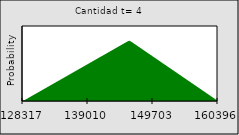
| Category | Series 0 |
|---|---|
| 128316.95757065 | 0 |
| nan | 0 |
| nan | 0.001 |
| nan | 0.001 |
| nan | 0.001 |
| nan | 0.002 |
| nan | 0.002 |
| nan | 0.003 |
| nan | 0.003 |
| nan | 0.003 |
| nan | 0.004 |
| nan | 0.004 |
| nan | 0.004 |
| nan | 0.005 |
| nan | 0.005 |
| nan | 0.006 |
| nan | 0.006 |
| nan | 0.006 |
| nan | 0.007 |
| nan | 0.007 |
| nan | 0.007 |
| nan | 0.008 |
| nan | 0.008 |
| nan | 0.009 |
| nan | 0.009 |
| nan | 0.009 |
| nan | 0.01 |
| nan | 0.01 |
| nan | 0.01 |
| nan | 0.011 |
| nan | 0.011 |
| nan | 0.012 |
| nan | 0.012 |
| 139010.03753870502 | 0.012 |
| nan | 0.013 |
| nan | 0.013 |
| nan | 0.013 |
| nan | 0.014 |
| nan | 0.014 |
| nan | 0.015 |
| nan | 0.015 |
| nan | 0.015 |
| nan | 0.016 |
| nan | 0.016 |
| nan | 0.016 |
| nan | 0.017 |
| nan | 0.017 |
| nan | 0.018 |
| nan | 0.018 |
| nan | 0.018 |
| nan | 0.019 |
| nan | 0.019 |
| nan | 0.019 |
| nan | 0.02 |
| nan | 0.02 |
| nan | 0.02 |
| nan | 0.019 |
| nan | 0.019 |
| nan | 0.018 |
| nan | 0.018 |
| nan | 0.018 |
| nan | 0.017 |
| nan | 0.017 |
| nan | 0.016 |
| nan | 0.016 |
| nan | 0.015 |
| 149703.11750676 | 0.015 |
| nan | 0.014 |
| nan | 0.014 |
| nan | 0.013 |
| nan | 0.013 |
| nan | 0.013 |
| nan | 0.012 |
| nan | 0.012 |
| nan | 0.011 |
| nan | 0.011 |
| nan | 0.01 |
| nan | 0.01 |
| nan | 0.009 |
| nan | 0.009 |
| nan | 0.009 |
| nan | 0.008 |
| nan | 0.008 |
| nan | 0.007 |
| nan | 0.007 |
| nan | 0.006 |
| nan | 0.006 |
| nan | 0.005 |
| nan | 0.005 |
| nan | 0.004 |
| nan | 0.004 |
| nan | 0.004 |
| nan | 0.003 |
| nan | 0.003 |
| nan | 0.002 |
| nan | 0.002 |
| nan | 0.001 |
| nan | 0.001 |
| nan | 0 |
| 160396.197474815 | 0 |